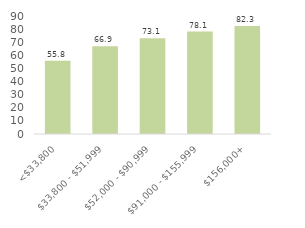
| Category | Series 0 |
|---|---|
| <$33,800 | 55.784 |
| $33,800 - $51,999 | 66.922 |
| $52,000 - $90,999 | 73.107 |
| $91,000 - $155,999 | 78.106 |
| $156,000+ | 82.333 |